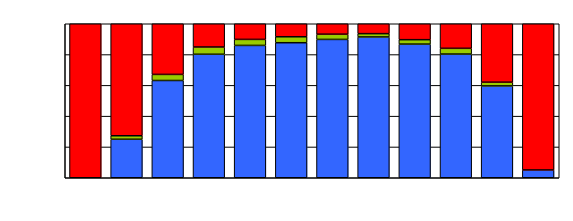
| Category | Series 0 | Series 1 | Series 2 |
|---|---|---|---|
| 0 | 0 | 0 | 262 |
| 1 | 22 | 2 | 64 |
| 2 | 48 | 3 | 25 |
| 3 | 85 | 5 | 16 |
| 4 | 110 | 5 | 13 |
| 5 | 114 | 5 | 11 |
| 6 | 106 | 4 | 8 |
| 7 | 128 | 3 | 9 |
| 8 | 151 | 5 | 18 |
| 9 | 151 | 7 | 30 |
| 10 | 99 | 4 | 63 |
| 11 | 27 | 0 | 506 |